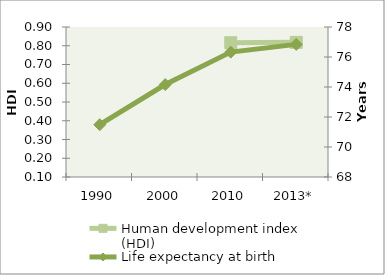
| Category | Human development index (HDI) |
|---|---|
| 1990 | 0 |
| 2000 | 0 |
| 2010 | 0.816 |
| 2013* | 0.818 |